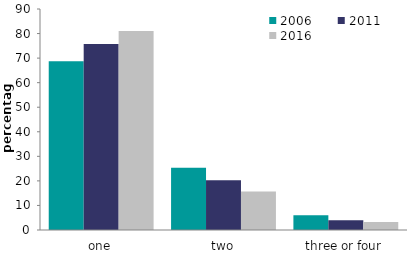
| Category | 2006 | 2011 | 2016 |
|---|---|---|---|
| one | 68.712 | 75.754 | 81.081 |
| two | 25.318 | 20.272 | 15.69 |
| three or four | 5.97 | 3.974 | 3.229 |